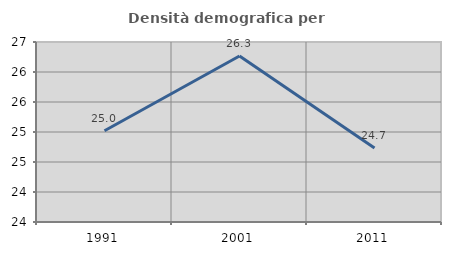
| Category | Densità demografica |
|---|---|
| 1991.0 | 25.022 |
| 2001.0 | 26.266 |
| 2011.0 | 24.735 |